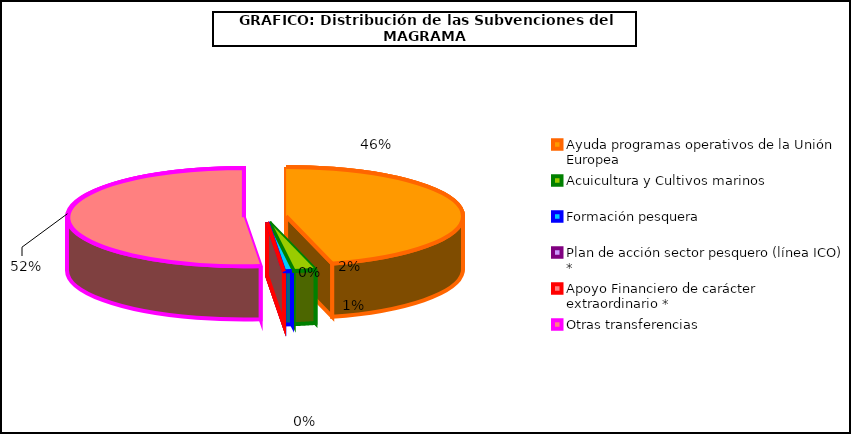
| Category | Ayuda programas operativos de la Unión Europea  |
|---|---|
| Ayuda programas operativos de la Unión Europea  | 6889.31 |
| Acuicultura y Cultivos marinos | 300 |
| Formación pesquera | 104.53 |
| Plan de acción sector pesquero (línea ICO) * | 0 |
| Apoyo Financiero de carácter extraordinario * | 0 |
| Otras transferencias | 7748.26 |